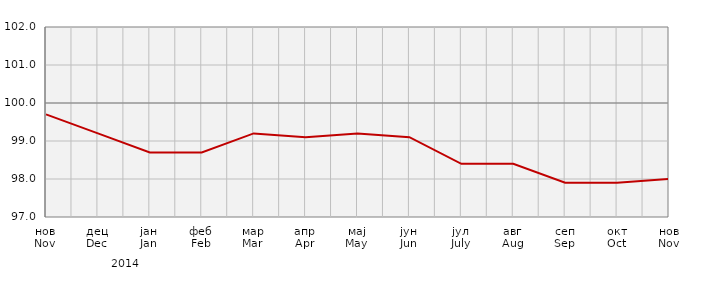
| Category | Индекси потрошачких цијена
Consumer price indices |
|---|---|
| нов
Nov | 99.7 |
| дец
Dec | 99.2 |
| јан
Jan | 98.7 |
| феб
Feb | 98.7 |
| мар
Mar | 99.2 |
| апр
Apr | 99.1 |
| мај
May | 99.2 |
| јун
Jun | 99.1 |
| јул
July | 98.4 |
| авг
Aug | 98.4 |
| сеп
Sep | 97.9 |
| окт
Oct | 97.9 |
| нов
Nov | 98 |